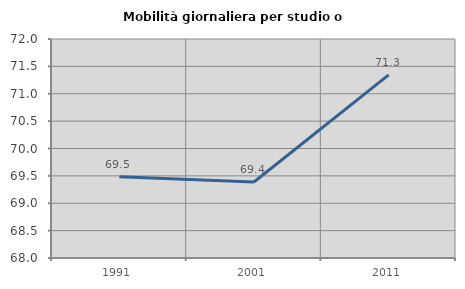
| Category | Mobilità giornaliera per studio o lavoro |
|---|---|
| 1991.0 | 69.485 |
| 2001.0 | 69.388 |
| 2011.0 | 71.344 |